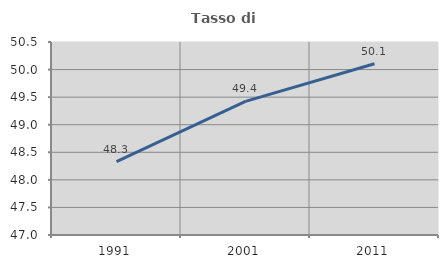
| Category | Tasso di occupazione   |
|---|---|
| 1991.0 | 48.332 |
| 2001.0 | 49.423 |
| 2011.0 | 50.105 |